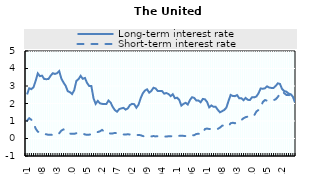
| Category | Long-term interest rate | Short-term interest rate |
|---|---|---|
| 2009-01 | 2.52 | 1.02 |
| 2009-02 | 2.87 | 1.16 |
| 2009-03 | 2.82 | 1.07 |
| 2009-04 | 2.93 | 0.89 |
| 2009-05 | 3.29 | 0.57 |
| 2009-06 | 3.72 | 0.39 |
| 2009-07 | 3.56 | 0.35 |
| 2009-08 | 3.59 | 0.3 |
| 2009-09 | 3.4 | 0.25 |
| 2009-10 | 3.39 | 0.24 |
| 2009-11 | 3.4 | 0.21 |
| 2009-12 | 3.59 | 0.22 |
| 2010-01 | 3.73 | 0.2 |
| 2010-02 | 3.69 | 0.19 |
| 2010-03 | 3.73 | 0.23 |
| 2010-04 | 3.85 | 0.3 |
| 2010-05 | 3.42 | 0.45 |
| 2010-06 | 3.2 | 0.52 |
| 2010-07 | 3.01 | 0.41 |
| 2010-08 | 2.7 | 0.32 |
| 2010-09 | 2.65 | 0.28 |
| 2010-10 | 2.54 | 0.27 |
| 2010-11 | 2.76 | 0.27 |
| 2010-12 | 3.29 | 0.3 |
| 2011-01 | 3.39 | 0.29 |
| 2011-02 | 3.58 | 0.28 |
| 2011-03 | 3.41 | 0.28 |
| 2011-04 | 3.46 | 0.23 |
| 2011-05 | 3.17 | 0.21 |
| 2011-06 | 3 | 0.22 |
| 2011-07 | 3 | 0.24 |
| 2011-08 | 2.3 | 0.29 |
| 2011-09 | 1.98 | 0.33 |
| 2011-10 | 2.15 | 0.37 |
| 2011-11 | 2.01 | 0.41 |
| 2011-12 | 1.98 | 0.49 |
| 2012-01 | 1.97 | 0.4 |
| 2012-02 | 1.97 | 0.3 |
| 2012-03 | 2.17 | 0.29 |
| 2012-04 | 2.05 | 0.29 |
| 2012-05 | 1.8 | 0.29 |
| 2012-06 | 1.62 | 0.32 |
| 2012-07 | 1.53 | 0.3 |
| 2012-08 | 1.68 | 0.26 |
| 2012-09 | 1.72 | 0.24 |
| 2012-10 | 1.75 | 0.23 |
| 2012-11 | 1.65 | 0.23 |
| 2012-12 | 1.72 | 0.24 |
| 2013-01 | 1.91 | 0.23 |
| 2013-02 | 1.98 | 0.22 |
| 2013-03 | 1.96 | 0.21 |
| 2013-04 | 1.76 | 0.2 |
| 2013-05 | 1.93 | 0.2 |
| 2013-06 | 2.3 | 0.19 |
| 2013-07 | 2.58 | 0.14 |
| 2013-08 | 2.74 | 0.12 |
| 2013-09 | 2.81 | 0.11 |
| 2013-10 | 2.62 | 0.12 |
| 2013-11 | 2.72 | 0.12 |
| 2013-12 | 2.9 | 0.14 |
| 2014-01 | 2.86 | 0.12 |
| 2014-02 | 2.71 | 0.13 |
| 2014-03 | 2.72 | 0.12 |
| 2014-04 | 2.71 | 0.12 |
| 2014-05 | 2.56 | 0.11 |
| 2014-06 | 2.6 | 0.11 |
| 2014-07 | 2.54 | 0.13 |
| 2014-08 | 2.42 | 0.13 |
| 2014-09 | 2.53 | 0.12 |
| 2014-10 | 2.3 | 0.12 |
| 2014-11 | 2.33 | 0.13 |
| 2014-12 | 2.21 | 0.15 |
| 2015-01 | 1.88 | 0.16 |
| 2015-02 | 1.98 | 0.15 |
| 2015-03 | 2.04 | 0.14 |
| 2015-04 | 1.94 | 0.13 |
| 2015-05 | 2.2 | 0.15 |
| 2015-06 | 2.36 | 0.18 |
| 2015-07 | 2.32 | 0.19 |
| 2015-08 | 2.17 | 0.26 |
| 2015-09 | 2.17 | 0.27 |
| 2015-10 | 2.07 | 0.25 |
| 2015-11 | 2.26 | 0.3 |
| 2015-12 | 2.24 | 0.54 |
| 2016-01 | 2.09 | 0.57 |
| 2016-02 | 1.78 | 0.54 |
| 2016-03 | 1.89 | 0.55 |
| 2016-04 | 1.81 | 0.55 |
| 2016-05 | 1.81 | 0.57 |
| 2016-06 | 1.64 | 0.55 |
| 2016-07 | 1.5 | 0.62 |
| 2016-08 | 1.56 | 0.73 |
| 2016-09 | 1.63 | 0.75 |
| 2016-10 | 1.76 | 0.72 |
| 2016-11 | 2.14 | 0.71 |
| 2016-12 | 2.49 | 0.87 |
| 2017-01 | 2.43 | 0.9 |
| 2017-02 | 2.42 | 0.87 |
| 2017-03 | 2.48 | 0.98 |
| 2017-04 | 2.3 | 1.03 |
| 2017-05 | 2.3 | 1.05 |
| 2017-06 | 2.19 | 1.16 |
| 2017-07 | 2.32 | 1.22 |
| 2017-08 | 2.21 | 1.25 |
| 2017-09 | 2.2 | 1.25 |
| 2017-10 | 2.36 | 1.26 |
| 2017-11 | 2.35 | 1.32 |
| 2017-12 | 2.4 | 1.54 |
| 2018-01 | 2.58 | 1.63 |
| 2018-02 | 2.86 | 1.78 |
| 2018-03 | 2.84 | 2.08 |
| 2018-04 | 2.87 | 2.2 |
| 2018-05 | 2.98 | 2.16 |
| 2018-06 | 2.91 | 2.19 |
| 2018-07 | 2.89 | 2.17 |
| 2018-08 | 2.89 | 2.19 |
| 2018-09 | 3 | 2.24 |
| 2018-10 | 3.15 | 2.37 |
| 2018-11 | 3.12 | 2.56 |
| 2018-12 | 2.83 | 2.69 |
| 2019-01 | 2.71 | 2.59 |
| 2019-02 | 2.68 | 2.49 |
| 2019-03 | 2.57 | 2.48 |
| 2019-04 | 2.53 | 2.47 |
| 2019-05 | 2.4 | 2.44 |
| 2019-06 | 2.07 | 2.3 |